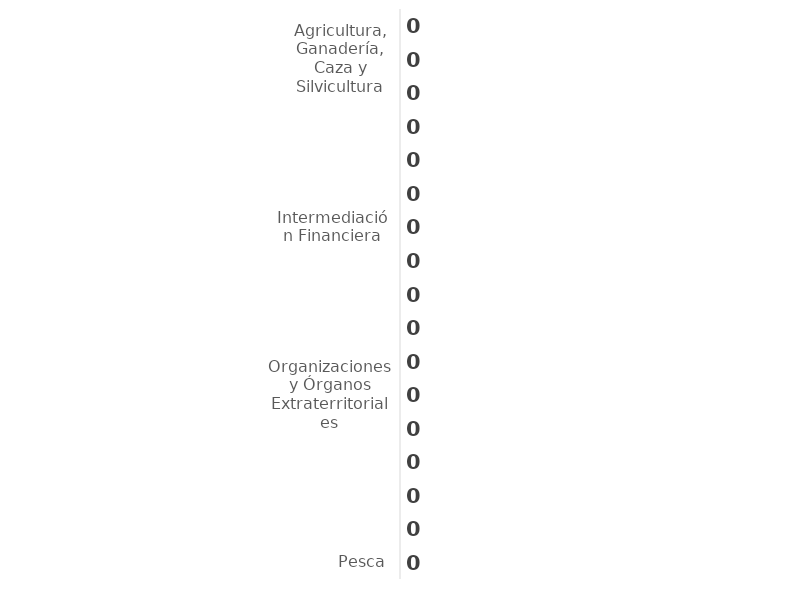
| Category | Series 0 |
|---|---|
| Pesca | 0 |
| Comercio; Reparación de Automotores, Motocicletas, Efectos Personales y Enseres Domésticos | 0 |
| Actividades Inmobiliarias de Alquiler y Empresariales y de Alquiler | 0 |
| Hogares Privados con Servicio Doméstico | 0 |
| Hoteles y Restaurantes | 0 |
| Organizaciones y Órganos Extraterritoriales | 0 |
| Explotación de Minas y Canteras | 0 |
| Suministros de Electricidad, Gas y Agua | 0 |
| Construcción | 0 |
| Transporte, Almacenamiento y Comunicaciones | 0 |
| Intermediación Financiera | 0 |
| Administración Pública y Defensa; Seguridad Social de Afiliación Obligatoria | 0 |
| Industrias Manufactureras | 0 |
| Servicios Sociales y de Salud | 0 |
| Otras Actividades de Servicios Comunitarios, Sociales y Personales | 0 |
| Agricultura, Ganadería, Caza y Silvicultura | 0 |
| Educación | 0 |